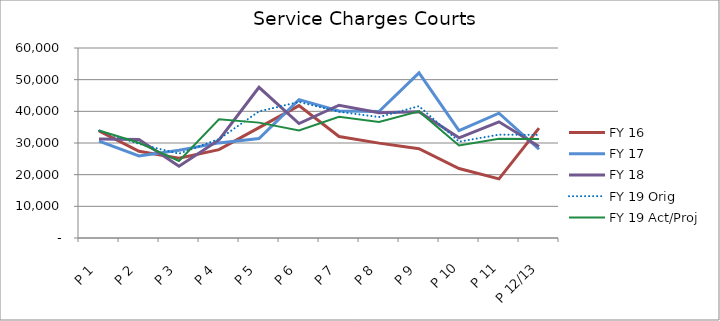
| Category | FY 16 | FY 17 | FY 18 | FY 19 Orig | FY 19 Act/Proj |
|---|---|---|---|---|---|
| P 1 | 33852.03 | 30577.47 | 31289.06 | 33862.031 | 33959.22 |
| P 2 | 27363.75 | 25936.87 | 31086.31 | 29713.199 | 30081.73 |
| P 3 | 25162.23 | 27706.29 | 22686.98 | 26625.452 | 24332.71 |
| P 4 | 27917.74 | 30034.75 | 30959.04 | 31243.404 | 37493.52 |
| P 5 | 34874.63 | 31409.02 | 47579.92 | 39986.637 | 36433.63 |
| P 6 | 41820.2 | 43717.51 | 36158.57 | 42963.529 | 33961.53 |
| P 7 | 32051.24 | 40132.72 | 41923.14 | 39872.189 | 38285.857 |
| P 8 | 29963.62 | 39946.55 | 39535.29 | 38192.796 | 36673.28 |
| P 9 | 28194 | 52144.13 | 39868.33 | 41644.078 | 39987.251 |
| P 10 | 21949.47 | 33941.96 | 31650.89 | 30425.006 | 29214.534 |
| P 11 | 18681 | 39418.99 | 36683.47 | 32636.992 | 31338.515 |
| P 12/13 | 34686 | 28028 | 28907.82 | 32549.687 | 31254.684 |